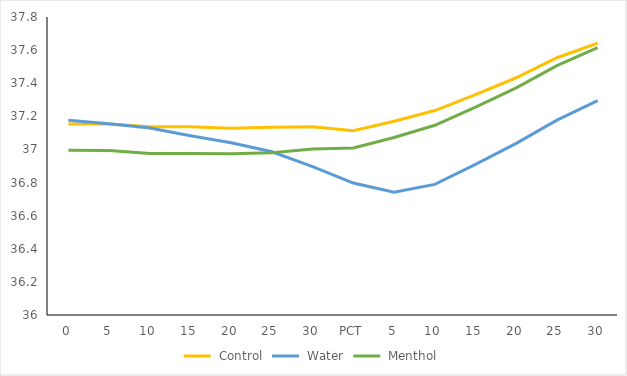
| Category |  Control |  Water |  Menthol |
|---|---|---|---|
| 0 | 37.153 | 37.176 | 36.995 |
| 5 | 37.153 | 37.155 | 36.994 |
| 10 | 37.137 | 37.129 | 36.975 |
| 15 | 37.137 | 37.083 | 36.976 |
| 20 | 37.128 | 37.04 | 36.974 |
| 25 | 37.134 | 36.986 | 36.98 |
| 30 | 37.137 | 36.896 | 37.002 |
| PCT | 37.113 | 36.797 | 37.009 |
| 5 | 37.17 | 36.741 | 37.072 |
| 10 | 37.235 | 36.789 | 37.146 |
| 15 | 37.331 | 36.91 | 37.255 |
| 20 | 37.433 | 37.037 | 37.372 |
| 25 | 37.554 | 37.177 | 37.506 |
| 30 | 37.642 | 37.295 | 37.615 |